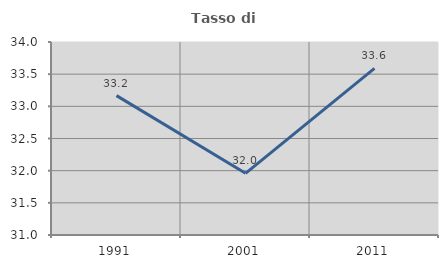
| Category | Tasso di occupazione   |
|---|---|
| 1991.0 | 33.166 |
| 2001.0 | 31.959 |
| 2011.0 | 33.591 |